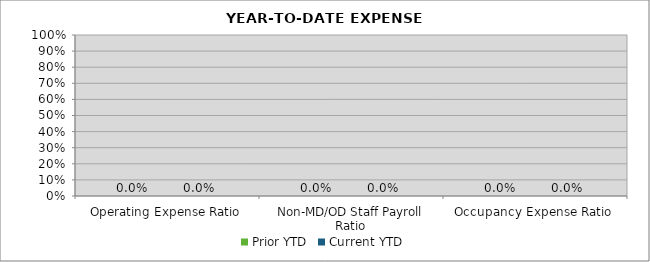
| Category | Prior YTD | Current YTD |
|---|---|---|
| Operating Expense Ratio | 0 | 0 |
| Non-MD/OD Staff Payroll Ratio | 0 | 0 |
| Occupancy Expense Ratio | 0 | 0 |